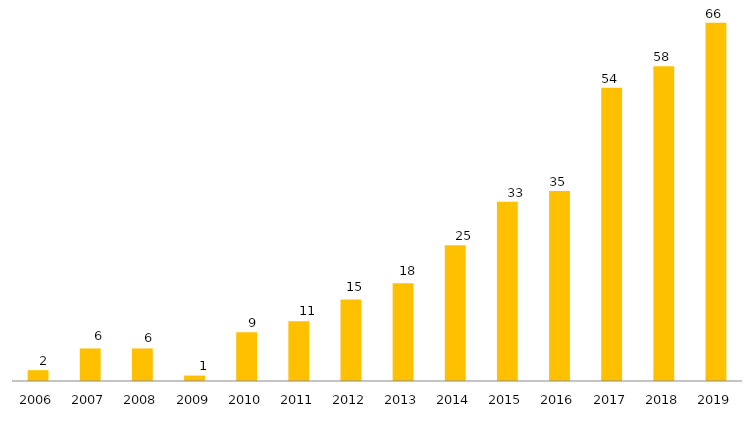
| Category | Monografias - Artigos Científicos / Dissertações / Teses |
|---|---|
| 2006.0 | 2 |
| 2007.0 | 6 |
| 2008.0 | 6 |
| 2009.0 | 1 |
| 2010.0 | 9 |
| 2011.0 | 11 |
| 2012.0 | 15 |
| 2013.0 | 18 |
| 2014.0 | 25 |
| 2015.0 | 33 |
| 2016.0 | 35 |
| 2017.0 | 54 |
| 2018.0 | 58 |
| 2019.0 | 66 |